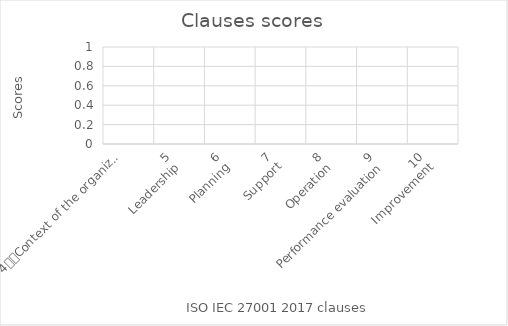
| Category | Scores |
|---|---|
| 4
Context of the organization | 0 |
| 5
Leadership | 0 |
| 6
Planning | 0 |
| 7
Support | 0 |
| 8
Operation | 0 |
| 9
Performance evaluation | 0 |
| 10
Improvement | 0 |